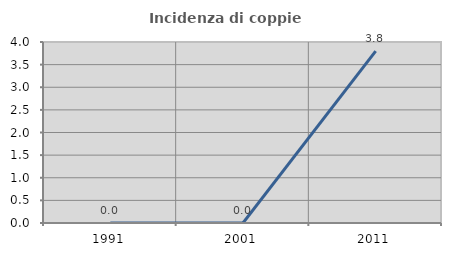
| Category | Incidenza di coppie miste |
|---|---|
| 1991.0 | 0 |
| 2001.0 | 0 |
| 2011.0 | 3.797 |